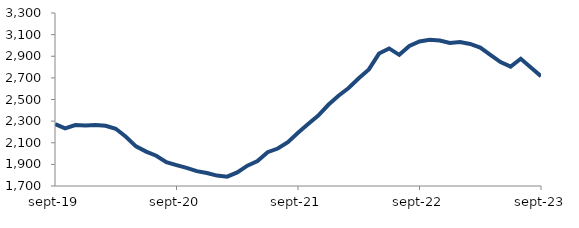
| Category | Series 0 |
|---|---|
| 2019-09-01 | 2273.768 |
| 2019-10-01 | 2233.304 |
| 2019-11-01 | 2263.898 |
| 2019-12-01 | 2259.926 |
| 2020-01-01 | 2265.053 |
| 2020-02-01 | 2256.766 |
| 2020-03-01 | 2229.161 |
| 2020-04-01 | 2155.791 |
| 2020-05-01 | 2066.843 |
| 2020-06-01 | 2018.026 |
| 2020-07-01 | 1979.558 |
| 2020-08-01 | 1920.368 |
| 2020-09-01 | 1893.237 |
| 2020-10-01 | 1867.4 |
| 2020-11-01 | 1837.195 |
| 2020-12-01 | 1819.546 |
| 2021-01-01 | 1796.45 |
| 2021-02-01 | 1786.603 |
| 2021-03-01 | 1826.072 |
| 2021-04-01 | 1887.798 |
| 2021-05-01 | 1930.372 |
| 2021-06-01 | 2012.926 |
| 2021-07-01 | 2046.434 |
| 2021-08-01 | 2105.806 |
| 2021-09-01 | 2192.514 |
| 2021-10-01 | 2272.972 |
| 2021-11-01 | 2351.334 |
| 2021-12-01 | 2451.171 |
| 2022-01-01 | 2534.613 |
| 2022-02-01 | 2606.357 |
| 2022-03-01 | 2696.948 |
| 2022-04-01 | 2778.264 |
| 2022-05-01 | 2924.682 |
| 2022-06-01 | 2972.281 |
| 2022-07-01 | 2912.933 |
| 2022-08-01 | 2994.913 |
| 2022-09-01 | 3036.467 |
| 2022-10-01 | 3052.236 |
| 2022-11-01 | 3044.767 |
| 2022-12-01 | 3023.141 |
| 2023-01-01 | 3030.956 |
| 2023-02-01 | 3013.674 |
| 2023-03-01 | 2979.861 |
| 2023-04-01 | 2913.014 |
| 2023-05-01 | 2845.832 |
| 2023-06-01 | 2803.594 |
| 2023-07-01 | 2876.7 |
| 2023-08-01 | 2796.297 |
| 2023-09-01 | 2715.691 |